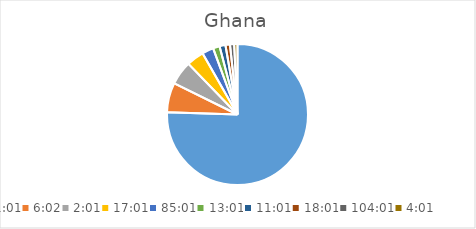
| Category | Series 0 |
|---|---|
| 0.042361111111111106 | 135.407 |
| 0.2513888888888889 | 12.085 |
| 0.08402777777777777 | 9.836 |
| 0.7090277777777777 | 7.152 |
| 3.542361111111111 | 4.729 |
| 0.5423611111111112 | 2.714 |
| 0.4590277777777778 | 2.444 |
| 0.7506944444444444 | 1.846 |
| 4.334027777777778 | 1.72 |
| 0.1673611111111111 | 1.347 |